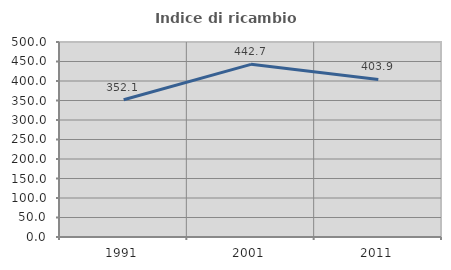
| Category | Indice di ricambio occupazionale  |
|---|---|
| 1991.0 | 352.055 |
| 2001.0 | 442.683 |
| 2011.0 | 403.937 |